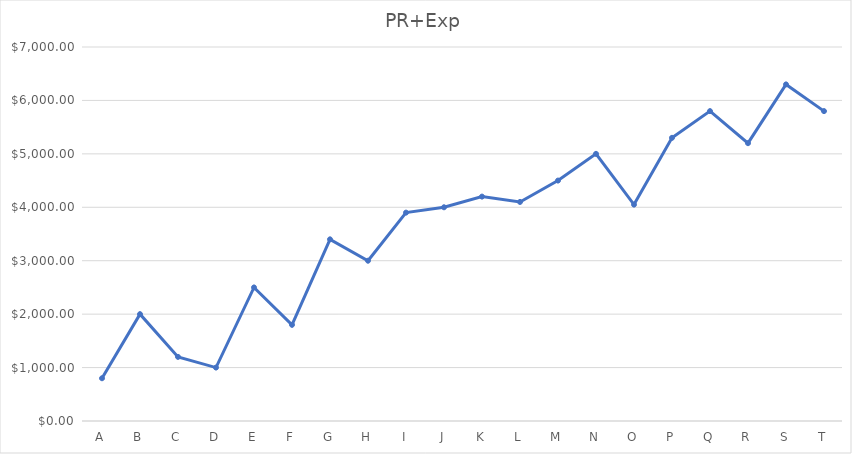
| Category | Series 0 |
|---|---|
| A | 800 |
| B | 2000 |
| C | 1200 |
| D | 1000 |
| E | 2500 |
| F | 1800 |
| G | 3400 |
| H | 3000 |
| I | 3900 |
| J | 4000 |
| K | 4200 |
| L | 4100 |
| M | 4500 |
| N | 5000 |
| O | 4050 |
| P | 5300 |
| Q | 5800 |
| R | 5200 |
| S | 6300 |
| T | 5800 |